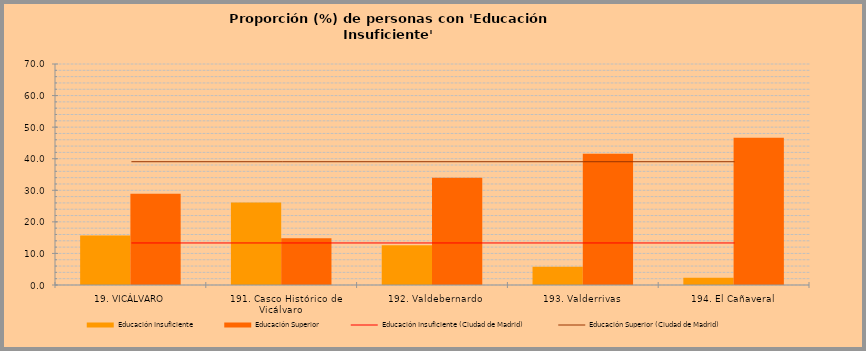
| Category | Educación Insuficiente | Educación Superior |
|---|---|---|
|  19. VICÁLVARO | 15.701 | 28.884 |
|    191. Casco Histórico de Vicálvaro | 26.162 | 14.776 |
|    192. Valdebernardo | 12.563 | 33.959 |
| 193. Valderrivas | 5.819 | 41.558 |
| 194. El Cañaveral | 2.277 | 46.643 |